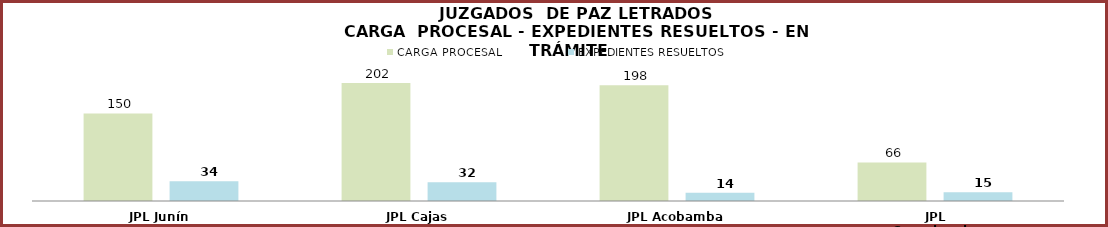
| Category | CARGA PROCESAL | EXPEDIENTES RESUELTOS |
|---|---|---|
| JPL Junín | 150 | 34 |
| JPL Cajas | 202 | 32 |
| JPL Acobamba | 198 | 14 |
| JPL Surcubamba | 66 | 15 |